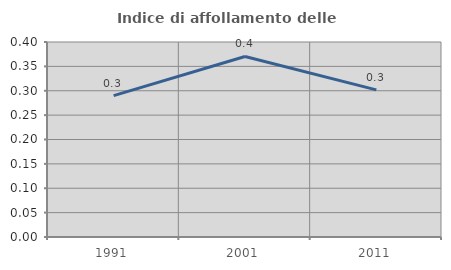
| Category | Indice di affollamento delle abitazioni  |
|---|---|
| 1991.0 | 0.29 |
| 2001.0 | 0.37 |
| 2011.0 | 0.302 |